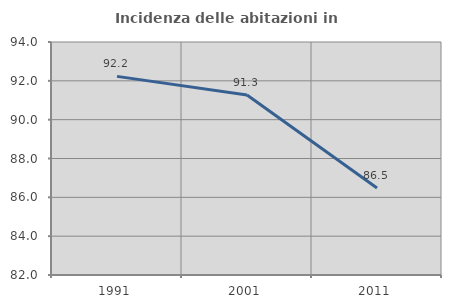
| Category | Incidenza delle abitazioni in proprietà  |
|---|---|
| 1991.0 | 92.229 |
| 2001.0 | 91.272 |
| 2011.0 | 86.482 |